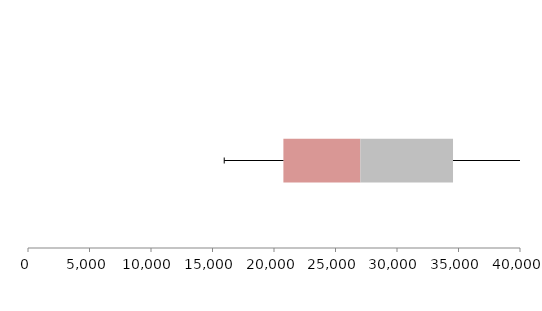
| Category | Series 1 | Series 2 | Series 3 |
|---|---|---|---|
| 0 | 20763.984 | 6256.752 | 7533.626 |